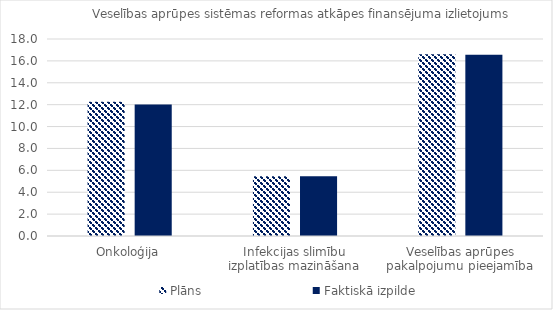
| Category | Plāns | Faktiskā izpilde |
|---|---|---|
| Onkoloģija | 12.262 | 12.005 |
| Infekcijas slimību izplatības mazināšana | 5.463 | 5.463 |
| Veselības aprūpes pakalpojumu pieejamība | 16.599 | 16.564 |